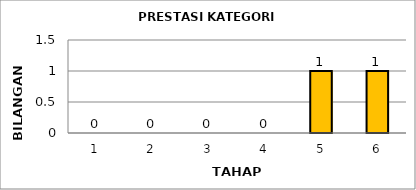
| Category | Series 0 |
|---|---|
| 1.0 | 0 |
| 2.0 | 0 |
| 3.0 | 0 |
| 4.0 | 0 |
| 5.0 | 1 |
| 6.0 | 1 |